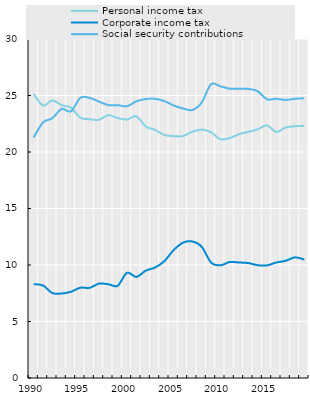
| Category | Personal income tax | Corporate income tax | Social security contributions |
|---|---|---|---|
| 1990.0 | 25.139 | 8.3 | 21.286 |
| 1991.0 | 24.107 | 8.19 | 22.618 |
| 1992.0 | 24.562 | 7.518 | 22.988 |
| 1993.0 | 24.147 | 7.478 | 23.81 |
| 1994.0 | 23.915 | 7.633 | 23.598 |
| 1995.0 | 23.038 | 7.988 | 24.792 |
| 1996.0 | 22.9 | 7.981 | 24.792 |
| 1997.0 | 22.854 | 8.352 | 24.461 |
| 1998.0 | 23.258 | 8.296 | 24.149 |
| 1999.0 | 23.005 | 8.162 | 24.145 |
| 2000.0 | 22.876 | 9.31 | 24.047 |
| 2001.0 | 23.157 | 8.945 | 24.483 |
| 2002.0 | 22.268 | 9.494 | 24.69 |
| 2003.0 | 21.962 | 9.776 | 24.707 |
| 2004.0 | 21.505 | 10.341 | 24.504 |
| 2005.0 | 21.406 | 11.319 | 24.115 |
| 2006.0 | 21.41 | 11.976 | 23.851 |
| 2007.0 | 21.79 | 12.086 | 23.716 |
| 2008.0 | 21.985 | 11.619 | 24.373 |
| 2009.0 | 21.749 | 10.226 | 25.994 |
| 2010.0 | 21.137 | 9.971 | 25.811 |
| 2011.0 | 21.232 | 10.266 | 25.611 |
| 2012.0 | 21.579 | 10.22 | 25.601 |
| 2013.0 | 21.783 | 10.173 | 25.587 |
| 2014.0 | 22.011 | 9.979 | 25.38 |
| 2015.0 | 22.354 | 9.968 | 24.664 |
| 2016.0 | 21.775 | 10.224 | 24.713 |
| 2017.0 | 22.167 | 10.374 | 24.608 |
| 2018.0 | 22.274 | 10.679 | 24.71 |
| 2019.0 | 22.304 | 10.481 | 24.757 |